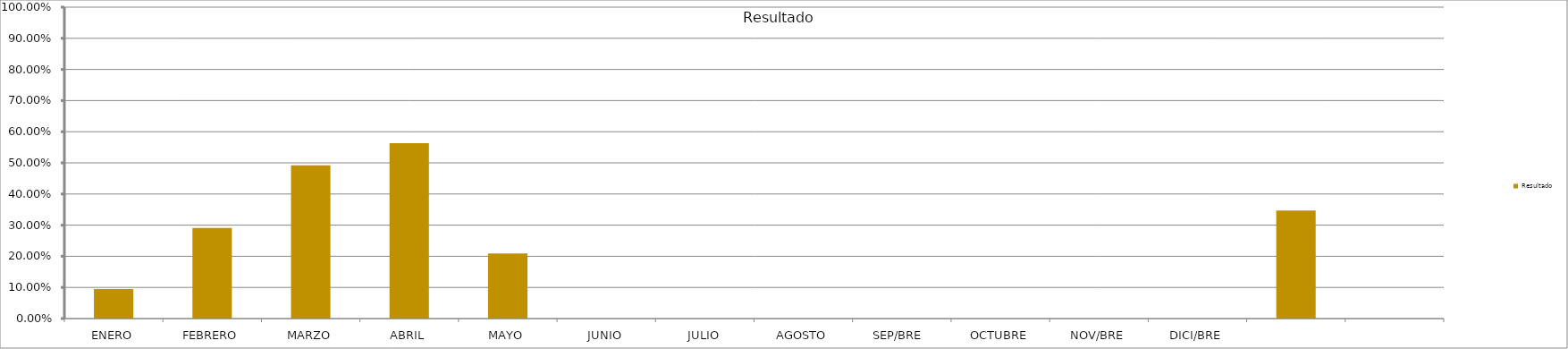
| Category | Resultado  |
|---|---|
| ENERO | 0.095 |
| FEBRERO | 0.291 |
| MARZO | 0.492 |
| ABRIL | 0.564 |
| MAYO | 0.209 |
| JUNIO | 0 |
| JULIO | 0 |
| AGOSTO | 0 |
| SEP/BRE  | 0 |
| OCTUBRE | 0 |
| NOV/BRE | 0 |
| DICI/BRE | 0 |